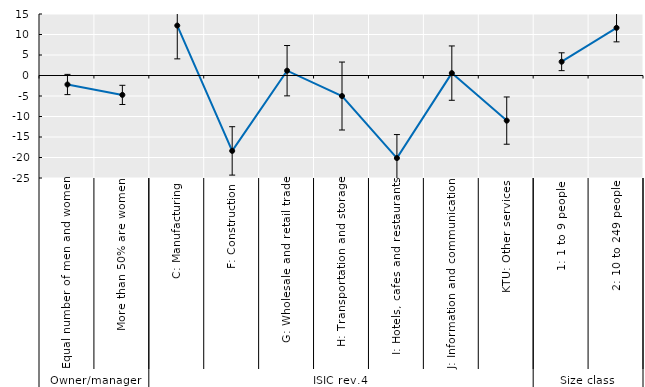
| Category | Series 0 |
|---|---|
| 0 | -2.195 |
| 1 | -4.731 |
| 2 | 12.182 |
| 3 | -18.391 |
| 4 | 1.171 |
| 5 | -5.007 |
| 6 | -20.143 |
| 7 | 0.581 |
| 8 | -11.001 |
| 9 | 3.36 |
| 10 | 11.633 |